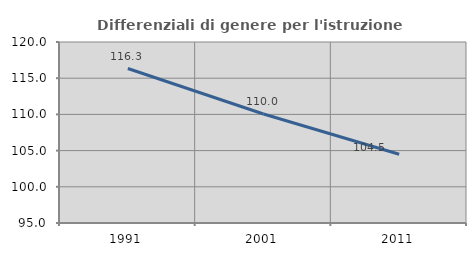
| Category | Differenziali di genere per l'istruzione superiore |
|---|---|
| 1991.0 | 116.339 |
| 2001.0 | 110.049 |
| 2011.0 | 104.49 |